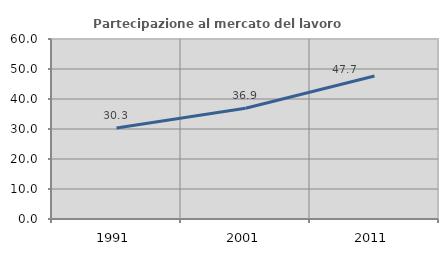
| Category | Partecipazione al mercato del lavoro  femminile |
|---|---|
| 1991.0 | 30.328 |
| 2001.0 | 36.923 |
| 2011.0 | 47.656 |